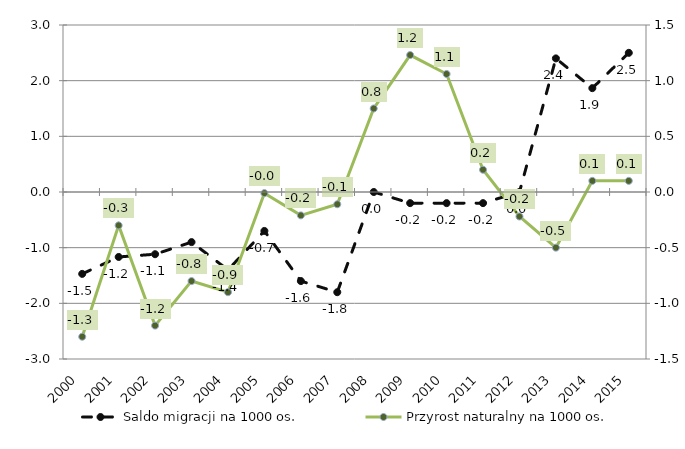
| Category | Saldo migracji na 1000 os. |
|---|---|
| 2000.0 | -1.471 |
| 2001.0 | -1.167 |
| 2002.0 | -1.118 |
| 2003.0 | -0.9 |
| 2004.0 | -1.4 |
| 2005.0 | -0.7 |
| 2006.0 | -1.6 |
| 2007.0 | -1.8 |
| 2008.0 | 0 |
| 2009.0 | -0.2 |
| 2010.0 | -0.2 |
| 2011.0 | -0.2 |
| 2012.0 | 0 |
| 2013.0 | 2.4 |
| 2014.0 | 1.866 |
| 2015.0 | 2.5 |